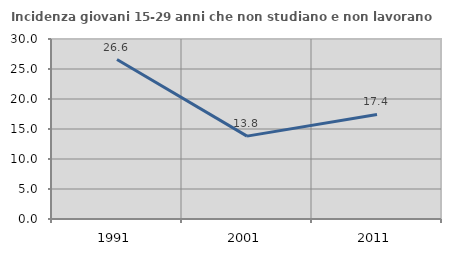
| Category | Incidenza giovani 15-29 anni che non studiano e non lavorano  |
|---|---|
| 1991.0 | 26.579 |
| 2001.0 | 13.812 |
| 2011.0 | 17.419 |